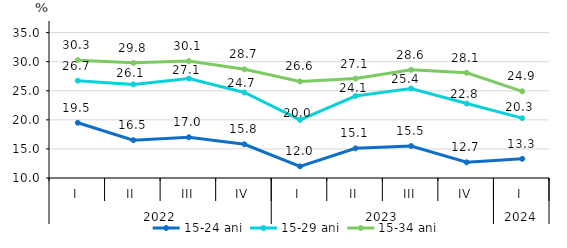
| Category | 15-24 ani | 15-29 ani | 15-34 ani |
|---|---|---|---|
| 0 | 19.497 | 26.744 | 30.262 |
| 1 | 16.5 | 26.1 | 29.8 |
| 2 | 17 | 27.1 | 30.1 |
| 3 | 15.8 | 24.7 | 28.7 |
| 4 | 12 | 20 | 26.6 |
| 5 | 15.1 | 24.1 | 27.1 |
| 6 | 15.5 | 25.4 | 28.6 |
| 7 | 12.7 | 22.8 | 28.1 |
| 8 | 13.3 | 20.3 | 24.9 |